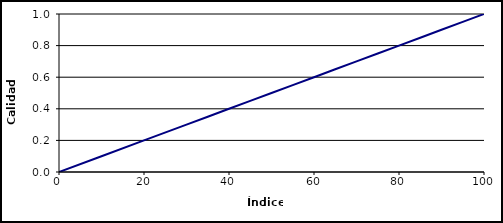
| Category | Series 0 |
|---|---|
| 0.0 | 0 |
| 10.0 | 0.1 |
| 20.0 | 0.2 |
| 30.0 | 0.3 |
| 35.0 | 0.35 |
| 40.0 | 0.4 |
| 45.0 | 0.45 |
| 50.0 | 0.5 |
| 55.0 | 0.55 |
| 60.0 | 0.6 |
| 65.0 | 0.65 |
| 70.0 | 0.7 |
| 75.0 | 0.75 |
| 80.0 | 0.8 |
| 85.0 | 0.85 |
| 90.0 | 0.9 |
| 95.0 | 0.95 |
| 100.0 | 1 |